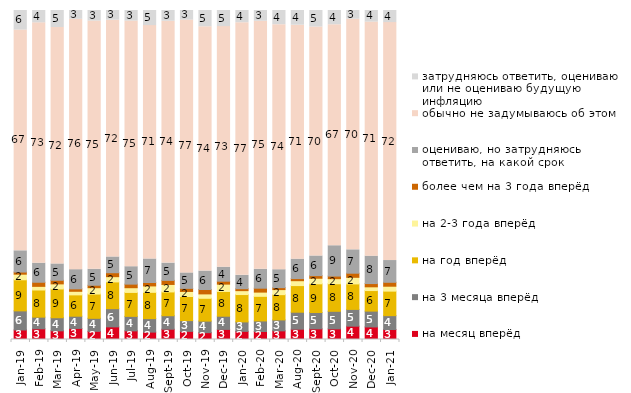
| Category | на месяц вперёд | на 3 месяца вперёд | на год вперёд | на 2-3 года вперёд | более чем на 3 года вперёд | оцениваю, но затрудняюсь ответить, на какой срок | обычно не задумываюсь об этом | затрудняюсь ответить, оцениваю или не оцениваю будущую инфляцию |
|---|---|---|---|---|---|---|---|---|
| 2019-01-01 | 2.9 | 5.8 | 9.45 | 1.7 | 0.65 | 6.45 | 67.1 | 5.95 |
| 2019-02-01 | 3.25 | 3.55 | 8.25 | 1.1 | 1.25 | 5.8 | 73.05 | 3.75 |
| 2019-03-01 | 2.636 | 3.978 | 8.752 | 1.542 | 1.094 | 4.973 | 71.855 | 5.172 |
| 2019-04-01 | 3.366 | 3.713 | 6.485 | 1.089 | 0.743 | 5.842 | 76.089 | 2.673 |
| 2019-05-01 | 2.476 | 3.962 | 7.38 | 1.932 | 0.743 | 4.854 | 75.433 | 3.219 |
| 2019-06-01 | 3.84 | 5.536 | 8.13 | 1.596 | 1.197 | 4.788 | 71.97 | 2.943 |
| 2019-07-01 | 2.624 | 4.406 | 7.277 | 1.436 | 1.089 | 5.297 | 74.653 | 3.218 |
| 2019-08-01 | 2.248 | 4.096 | 7.992 | 1.948 | 1.049 | 7.143 | 70.929 | 4.595 |
| 2019-09-01 | 3.119 | 4.109 | 7.228 | 2.277 | 1.238 | 5.248 | 73.515 | 3.267 |
| 2019-10-01 | 2.475 | 3.267 | 7.327 | 1.535 | 0.941 | 4.703 | 76.832 | 2.921 |
| 2019-11-01 | 2.079 | 3.515 | 6.931 | 1.337 | 1.337 | 5.594 | 74.257 | 4.95 |
| 2019-12-01 | 3.069 | 4.01 | 7.525 | 2.228 | 0.891 | 4.257 | 73.119 | 4.901 |
| 2020-01-01 | 2.475 | 2.871 | 8.317 | 1.188 | 0.594 | 4.059 | 76.782 | 3.713 |
| 2020-02-01 | 2.426 | 3.218 | 7.475 | 1.287 | 1.188 | 5.743 | 75.396 | 3.267 |
| 2020-03-01 | 2.628 | 3.322 | 7.685 | 1.537 | 0.595 | 5.454 | 74.467 | 4.313 |
| 2020-08-01 | 3.128 | 5.164 | 8.093 | 1.49 | 0.645 | 5.909 | 71.102 | 4.469 |
| 2020-09-01 | 3.235 | 4.978 | 8.711 | 1.692 | 0.796 | 5.973 | 69.587 | 5.027 |
| 2020-10-01 | 3.239 | 5.331 | 8.371 | 1.545 | 0.797 | 9.218 | 67.165 | 4.335 |
| 2020-11-01 | 4.05 | 5.1 | 7.75 | 2 | 1.25 | 7.1 | 70.1 | 2.65 |
| 2020-12-01 | 3.818 | 4.809 | 6.247 | 1.14 | 0.992 | 8.329 | 71.145 | 3.52 |
| 2021-01-01 | 3.03 | 4.223 | 7.452 | 1.49 | 1.192 | 6.607 | 72.33 | 3.676 |